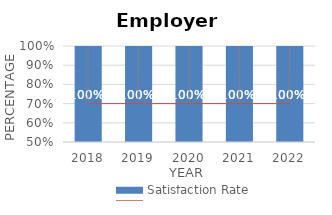
| Category | Satisfaction Rate |
|---|---|
| 2018.0 | 1 |
| 2019.0 | 1 |
| 2020.0 | 1 |
| 2021.0 | 1 |
| 2022.0 | 1 |